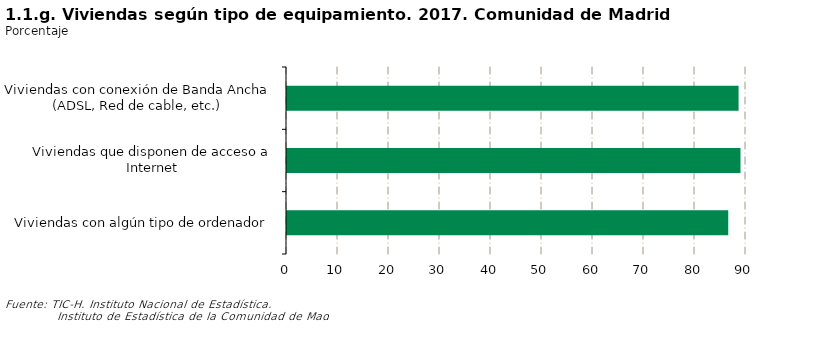
| Category | Series 0 |
|---|---|
| Viviendas con algún tipo de ordenador | 86.517 |
| Viviendas que disponen de acceso a Internet | 88.918 |
| Viviendas con conexión de Banda Ancha (ADSL, Red de cable, etc.) | 88.543 |